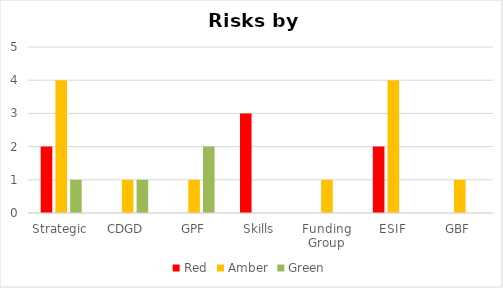
| Category | Red | Amber | Green |
|---|---|---|---|
| Strategic | 2 | 4 | 1 |
| CDGD | 0 | 1 | 1 |
| GPF | 0 | 1 | 2 |
| Skills | 3 | 0 | 0 |
| Funding Group | 0 | 1 | 0 |
| ESIF | 2 | 4 | 0 |
| GBF | 0 | 1 | 0 |